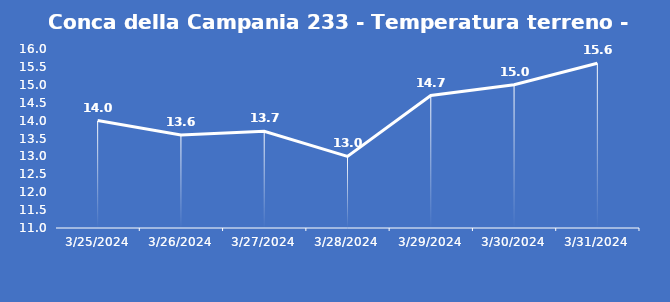
| Category | Conca della Campania 233 - Temperatura terreno - Grezzo (°C) |
|---|---|
| 3/25/24 | 14 |
| 3/26/24 | 13.6 |
| 3/27/24 | 13.7 |
| 3/28/24 | 13 |
| 3/29/24 | 14.7 |
| 3/30/24 | 15 |
| 3/31/24 | 15.6 |